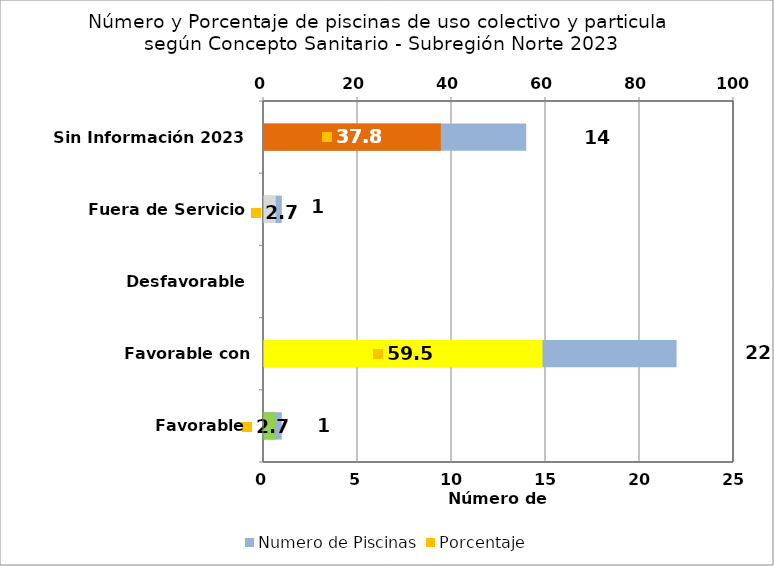
| Category | Numero de Piscinas |
|---|---|
| Favorable | 1 |
| Favorable con Requerimientos | 22 |
| Desfavorable | 0 |
| Fuera de Servicio | 1 |
| Sin Información 2023 | 14 |